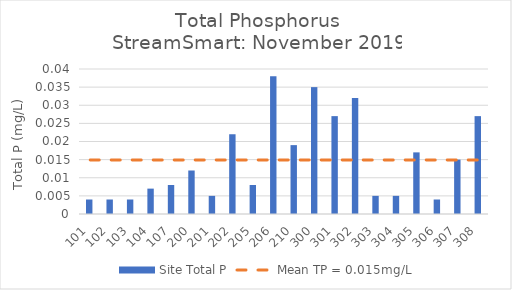
| Category | Site Total P |
|---|---|
| 101.0 | 0.004 |
| 102.0 | 0.004 |
| 103.0 | 0.004 |
| 104.0 | 0.007 |
| 107.0 | 0.008 |
| 200.0 | 0.012 |
| 201.0 | 0.005 |
| 202.0 | 0.022 |
| 205.0 | 0.008 |
| 206.0 | 0.038 |
| 210.0 | 0.019 |
| 300.0 | 0.035 |
| 301.0 | 0.027 |
| 302.0 | 0.032 |
| 303.0 | 0.005 |
| 304.0 | 0.005 |
| 305.0 | 0.017 |
| 306.0 | 0.004 |
| 307.0 | 0.015 |
| 308.0 | 0.027 |